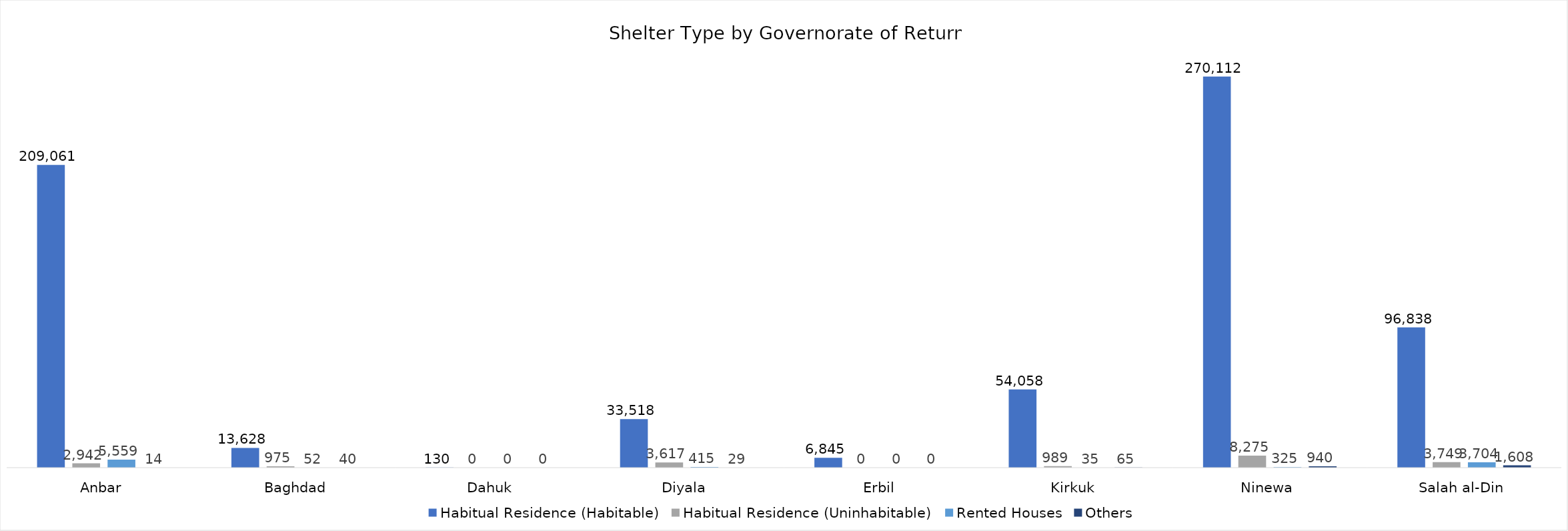
| Category | Habitual Residence (Habitable) | Habitual Residence (Uninhabitable) | Rented Houses | Others |
|---|---|---|---|---|
| Anbar | 209061 | 2942 | 5559 | 14 |
| Baghdad | 13628 | 975 | 52 | 40 |
| Dahuk | 130 | 0 | 0 | 0 |
| Diyala | 33518 | 3617 | 415 | 29 |
| Erbil | 6845 | 0 | 0 | 0 |
| Kirkuk | 54058 | 989 | 35 | 65 |
| Ninewa | 270112 | 8275 | 325 | 940 |
| Salah al-Din | 96838 | 3749 | 3704 | 1608 |